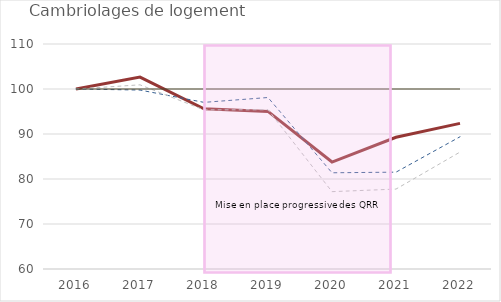
| Category | QRR | Unités urbaines englobantes | Unités urbaines de plus de 10 000 hab. | Series 0 |
|---|---|---|---|---|
| 2016.0 | 100 | 100 | 100 | 100 |
| 2017.0 | 102.646 | 99.767 | 100.927 | 100 |
| 2018.0 | 95.584 | 97.03 | 95.361 | 100 |
| 2019.0 | 95.025 | 98.109 | 95.388 | 100 |
| 2020.0 | 83.771 | 81.382 | 77.188 | 100 |
| 2021.0 | 89.268 | 81.521 | 77.76 | 100 |
| 2022.0 | 92.361 | 89.384 | 85.985 | 100 |